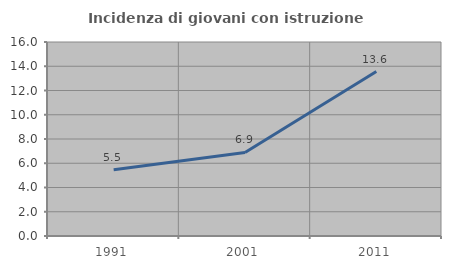
| Category | Incidenza di giovani con istruzione universitaria |
|---|---|
| 1991.0 | 5.46 |
| 2001.0 | 6.889 |
| 2011.0 | 13.563 |